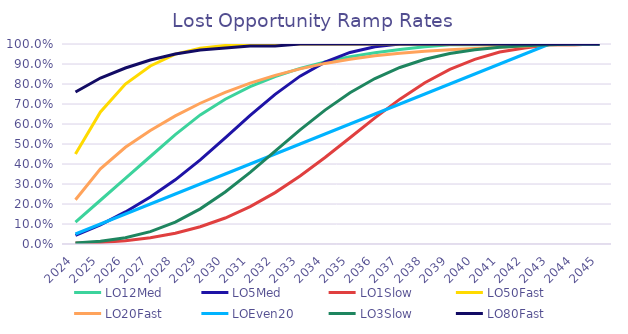
| Category | LO12Med | LO5Med | LO1Slow | LO50Fast | LO20Fast | LOEven20 | LO3Slow | LO80Fast |
|---|---|---|---|---|---|---|---|---|
| 2024.0 | 0.109 | 0.043 | 0.005 | 0.45 | 0.221 | 0.05 | 0.006 | 0.76 |
| 2025.0 | 0.219 | 0.096 | 0.008 | 0.66 | 0.376 | 0.1 | 0.014 | 0.83 |
| 2026.0 | 0.328 | 0.16 | 0.017 | 0.8 | 0.484 | 0.15 | 0.032 | 0.88 |
| 2027.0 | 0.437 | 0.235 | 0.032 | 0.89 | 0.567 | 0.2 | 0.062 | 0.92 |
| 2028.0 | 0.547 | 0.321 | 0.054 | 0.95 | 0.64 | 0.25 | 0.109 | 0.95 |
| 2029.0 | 0.645 | 0.421 | 0.086 | 0.979 | 0.704 | 0.3 | 0.176 | 0.97 |
| 2030.0 | 0.724 | 0.531 | 0.13 | 0.993 | 0.758 | 0.35 | 0.26 | 0.98 |
| 2031.0 | 0.787 | 0.643 | 0.187 | 0.998 | 0.804 | 0.4 | 0.358 | 0.99 |
| 2032.0 | 0.837 | 0.748 | 0.257 | 1 | 0.843 | 0.45 | 0.464 | 0.99 |
| 2033.0 | 0.878 | 0.839 | 0.34 | 1 | 0.876 | 0.5 | 0.57 | 1 |
| 2034.0 | 0.91 | 0.909 | 0.433 | 1 | 0.903 | 0.55 | 0.669 | 1 |
| 2035.0 | 0.936 | 0.958 | 0.531 | 1 | 0.924 | 0.6 | 0.756 | 1 |
| 2036.0 | 0.956 | 0.987 | 0.631 | 1 | 0.941 | 0.65 | 0.827 | 1 |
| 2037.0 | 0.973 | 1 | 0.724 | 1 | 0.954 | 0.7 | 0.883 | 1 |
| 2038.0 | 0.986 | 1 | 0.806 | 1 | 0.964 | 0.75 | 0.923 | 1 |
| 2039.0 | 0.997 | 1 | 0.873 | 1 | 0.971 | 0.8 | 0.952 | 1 |
| 2040.0 | 0.997 | 1 | 0.923 | 1 | 0.977 | 0.85 | 0.971 | 1 |
| 2041.0 | 0.997 | 1 | 0.96 | 1 | 0.984 | 0.9 | 0.983 | 1 |
| 2042.0 | 0.997 | 1 | 0.98 | 1 | 0.989 | 0.95 | 0.991 | 1 |
| 2043.0 | 0.997 | 1 | 0.996 | 1 | 0.996 | 1 | 0.996 | 1 |
| 2044.0 | 0.997 | 1 | 0.996 | 1 | 0.996 | 1 | 1 | 1 |
| 2045.0 | 1 | 1 | 1 | 1 | 1 | 1 | 1 | 1 |